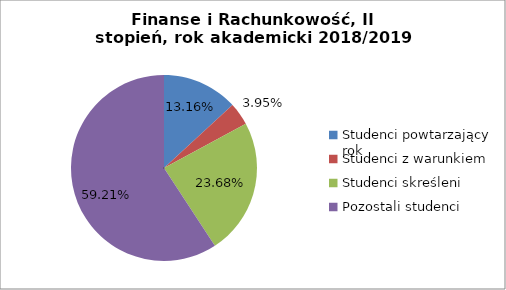
| Category | Series 0 |
|---|---|
| Studenci powtarzający rok | 20 |
| Studenci z warunkiem | 6 |
| Studenci skreśleni | 36 |
| Pozostali studenci | 90 |